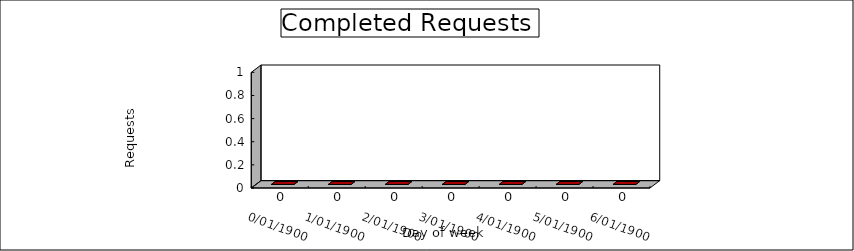
| Category | Completed on same day |
|---|---|
| 0.0 | 0 |
| 1900-01-01 | 0 |
| 1900-01-02 | 0 |
| 1900-01-03 | 0 |
| 1900-01-04 | 0 |
| 1900-01-05 | 0 |
| 1900-01-06 | 0 |